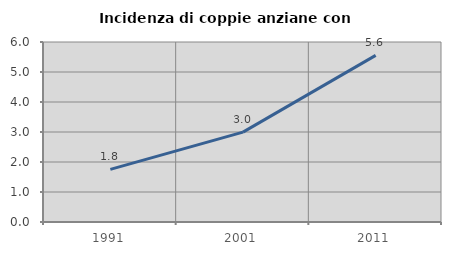
| Category | Incidenza di coppie anziane con figli |
|---|---|
| 1991.0 | 1.754 |
| 2001.0 | 2.995 |
| 2011.0 | 5.556 |